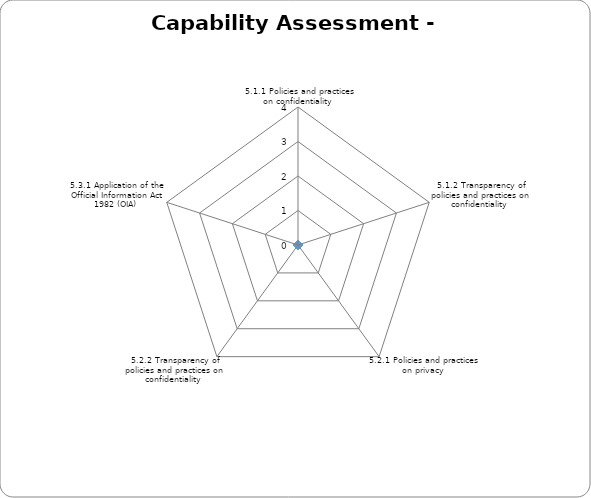
| Category | Series 0 |
|---|---|
|  5.1.1 Policies and practices on confidentiality | 0 |
| 5.1.2 Transparency of policies and practices on confidentiality  | 0 |
| 5.2.1 Policies and practices on privacy  | 0 |
| 5.2.2 Transparency of policies and practices on confidentiality  | 0 |
| 5.3.1 Application of the Official Information Act 1982 (OIA)  | 0 |